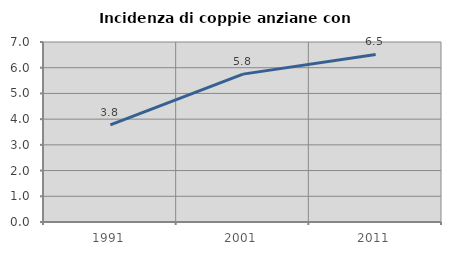
| Category | Incidenza di coppie anziane con figli |
|---|---|
| 1991.0 | 3.78 |
| 2001.0 | 5.751 |
| 2011.0 | 6.515 |